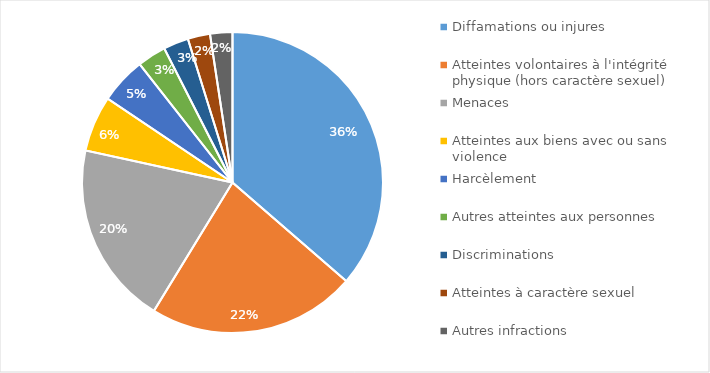
| Category | Crimes ou délits  |
|---|---|
| Diffamations ou injures | 0.364 |
| Atteintes volontaires à l'intégrité physique (hors caractère sexuel) | 0.224 |
| Menaces | 0.197 |
| Atteintes aux biens avec ou sans violence | 0.06 |
| Harcèlement | 0.05 |
| Autres atteintes aux personnes | 0.031 |
| Discriminations | 0.027 |
| Atteintes à caractère sexuel | 0.024 |
| Autres infractions | 0.024 |